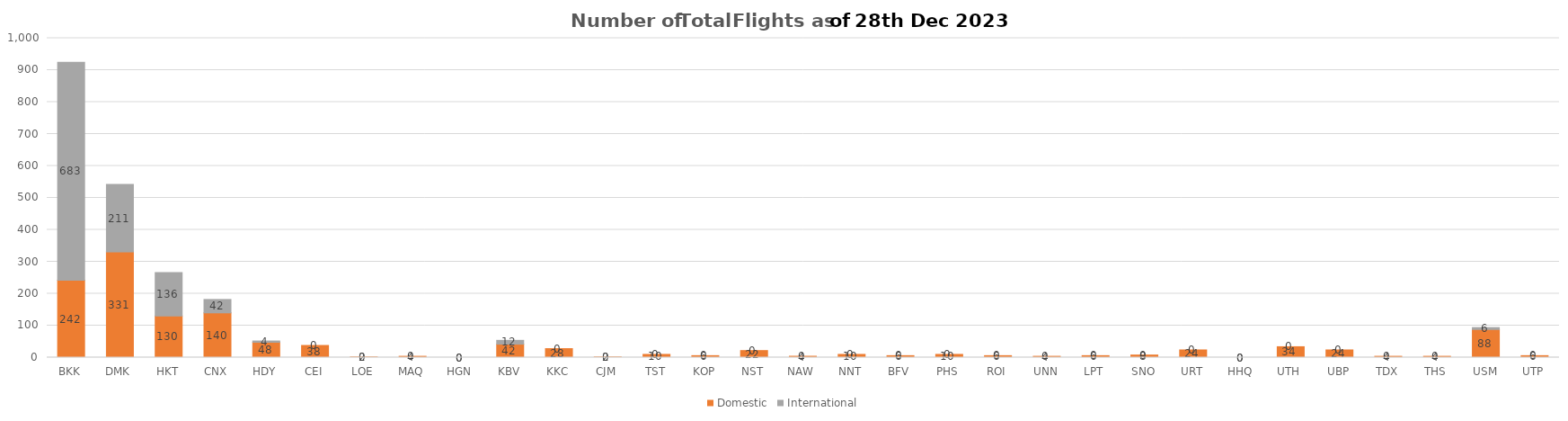
| Category | Domestic | International |
|---|---|---|
| BKK | 242 | 683 |
| DMK | 331 | 211 |
| HKT | 130 | 136 |
| CNX | 140 | 42 |
| HDY | 48 | 4 |
| CEI | 38 | 0 |
| LOE | 2 | 0 |
| MAQ | 4 | 0 |
| HGN | 0 | 0 |
| KBV | 42 | 12 |
| KKC | 28 | 0 |
| CJM | 2 | 0 |
| TST | 10 | 0 |
| KOP | 6 | 0 |
| NST | 22 | 0 |
| NAW | 4 | 0 |
| NNT | 10 | 0 |
| BFV | 6 | 0 |
| PHS | 10 | 0 |
| ROI | 6 | 0 |
| UNN | 4 | 0 |
| LPT | 6 | 0 |
| SNO | 8 | 0 |
| URT | 24 | 0 |
| HHQ | 0 | 0 |
| UTH | 34 | 0 |
| UBP | 24 | 0 |
| TDX | 4 | 0 |
| THS | 4 | 0 |
| USM | 88 | 6 |
| UTP | 6 | 0 |